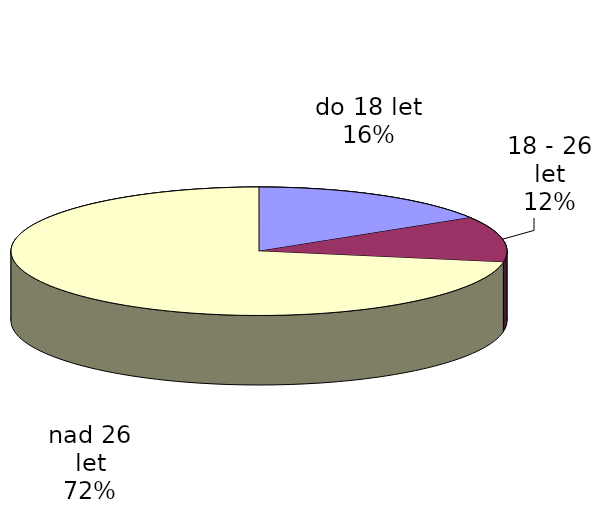
| Category | Series 0 |
|---|---|
| do 18 let | 58036 |
| 18 - 26 let | 41119 |
| nad 26 let | 258162 |